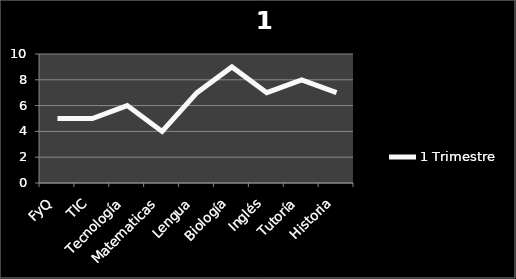
| Category | 1 Trimestre |
|---|---|
| FyQ | 5 |
| TIC | 5 |
| Tecnología | 6 |
| Matematicas | 4 |
| Lengua | 7 |
| Biología | 9 |
| Inglés | 7 |
| Tutoría | 8 |
| Historia | 7 |